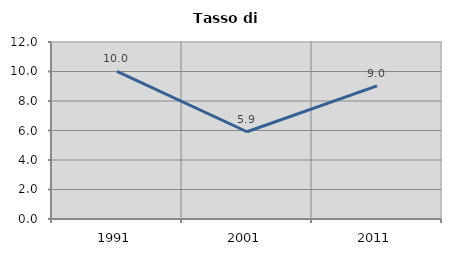
| Category | Tasso di disoccupazione   |
|---|---|
| 1991.0 | 10.015 |
| 2001.0 | 5.915 |
| 2011.0 | 9.031 |